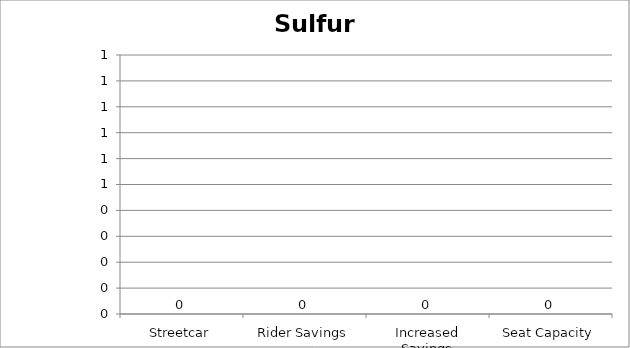
| Category | Sulfur Oxides |
|---|---|
| Streetcar | 0 |
| Rider Savings | 0 |
| Increased Savings | 0 |
| Seat Capacity | 0 |